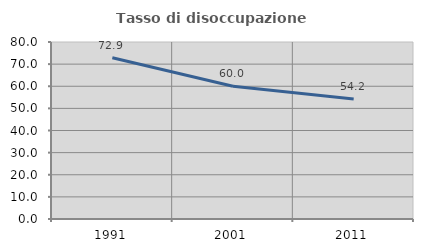
| Category | Tasso di disoccupazione giovanile  |
|---|---|
| 1991.0 | 72.917 |
| 2001.0 | 60 |
| 2011.0 | 54.237 |